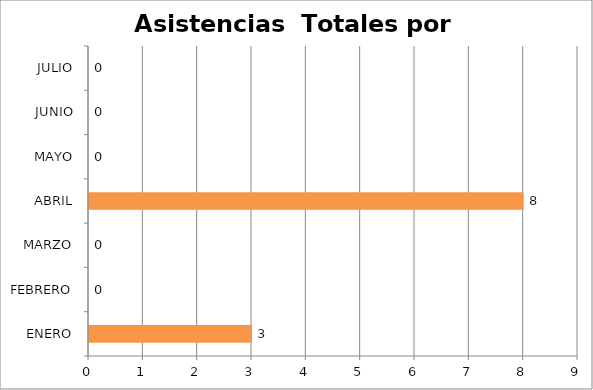
| Category | Series 0 |
|---|---|
| ENERO | 3 |
| FEBRERO | 0 |
| MARZO | 0 |
| ABRIL | 8 |
| MAYO | 0 |
| JUNIO | 0 |
| JULIO | 0 |